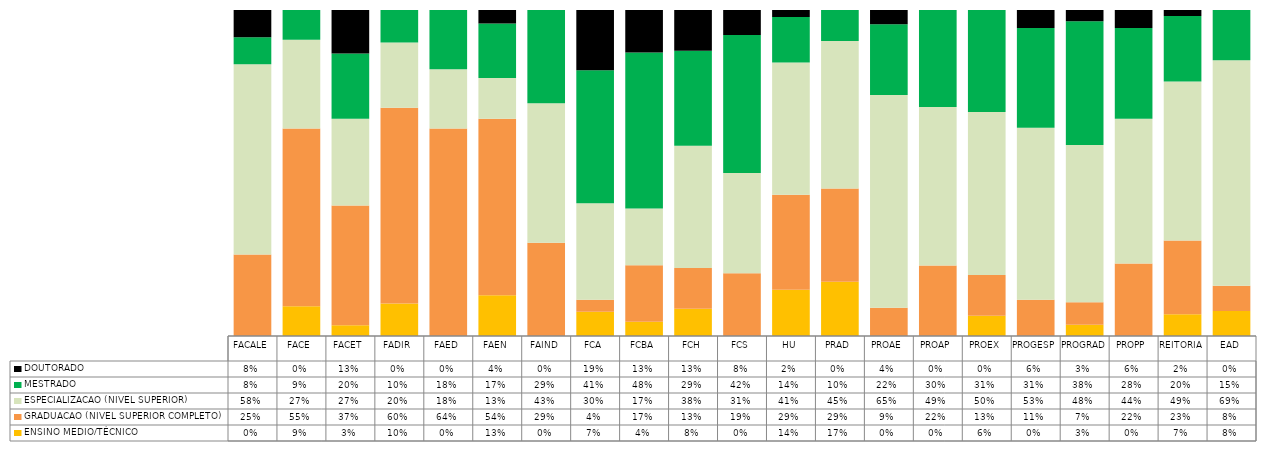
| Category | ENSINO MEDIO/TÉCNICO | GRADUACAO (NIVEL SUPERIOR COMPLETO) | ESPECIALIZACAO (NIVEL SUPERIOR)   | MESTRADO | DOUTORADO                             |
|---|---|---|---|---|---|
| FACALE | 0 | 0.25 | 0.583 | 0.083 | 0.083 |
| FACE | 0.091 | 0.545 | 0.273 | 0.091 | 0 |
| FACET | 0.033 | 0.367 | 0.267 | 0.2 | 0.133 |
| FADIR | 0.1 | 0.6 | 0.2 | 0.1 | 0 |
| FAED | 0 | 0.636 | 0.182 | 0.182 | 0 |
| FAEN | 0.125 | 0.542 | 0.125 | 0.167 | 0.042 |
| FAIND | 0 | 0.286 | 0.429 | 0.286 | 0 |
| FCA | 0.074 | 0.037 | 0.296 | 0.407 | 0.185 |
| FCBA | 0.043 | 0.174 | 0.174 | 0.478 | 0.13 |
| FCH | 0.083 | 0.125 | 0.375 | 0.292 | 0.125 |
| FCS | 0 | 0.192 | 0.308 | 0.423 | 0.077 |
| HU | 0.142 | 0.292 | 0.406 | 0.139 | 0.022 |
| PRAD | 0.167 | 0.286 | 0.452 | 0.095 | 0 |
| PROAE | 0 | 0.087 | 0.652 | 0.217 | 0.043 |
| PROAP | 0 | 0.216 | 0.486 | 0.297 | 0 |
| PROEX | 0.062 | 0.125 | 0.5 | 0.312 | 0 |
| PROGESP | 0 | 0.111 | 0.528 | 0.306 | 0.056 |
| PROGRAD | 0.034 | 0.069 | 0.483 | 0.379 | 0.034 |
| PROPP | 0 | 0.222 | 0.444 | 0.278 | 0.056 |
| REITORIA | 0.067 | 0.226 | 0.488 | 0.201 | 0.018 |
| EAD | 0.077 | 0.077 | 0.692 | 0.154 | 0 |